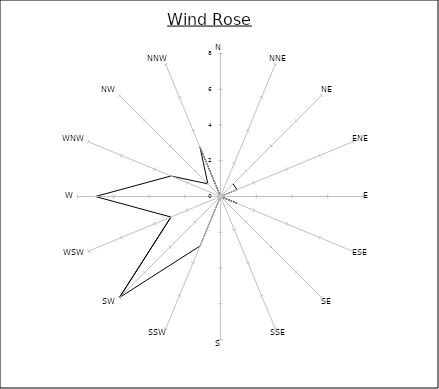
| Category | Series 0 |
|---|---|
| N | 0 |
| NNE | 0 |
| NE | 1 |
| ENE | 1 |
| E | 0 |
| ESE | 1 |
| SE | 0 |
| SSE | 0 |
| S | 0 |
| SSW | 3 |
| SW | 8 |
| WSW | 3 |
| W | 7 |
| WNW | 3 |
| NW | 1 |
| NNW | 3 |